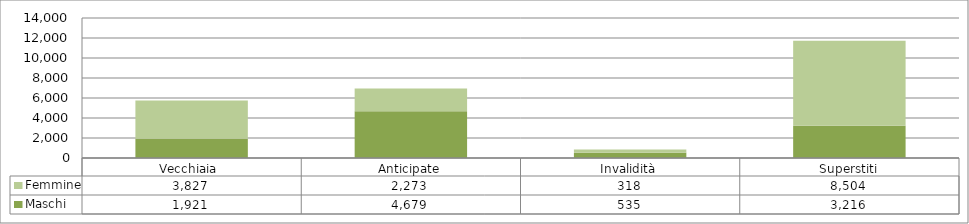
| Category | Maschi | Femmine |
|---|---|---|
| Vecchiaia  | 1921 | 3827 |
| Anticipate | 4679 | 2273 |
| Invalidità | 535 | 318 |
| Superstiti | 3216 | 8504 |